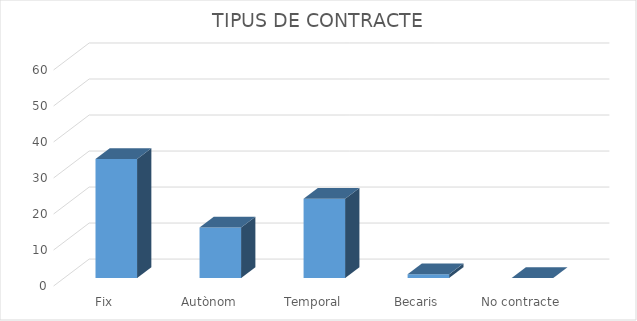
| Category | Series 0 |
|---|---|
| Fix | 33 |
| Autònom | 14 |
| Temporal | 22 |
| Becaris | 1 |
| No contracte | 0 |